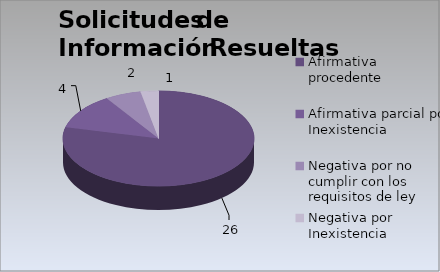
| Category | Series 0 |
|---|---|
| Afirmativa procedente  | 26 |
| Afirmativa parcial por Inexistencia  | 4 |
| Negativa por no cumplir con los requisitos de ley | 2 |
| Negativa por Inexistencia | 1 |